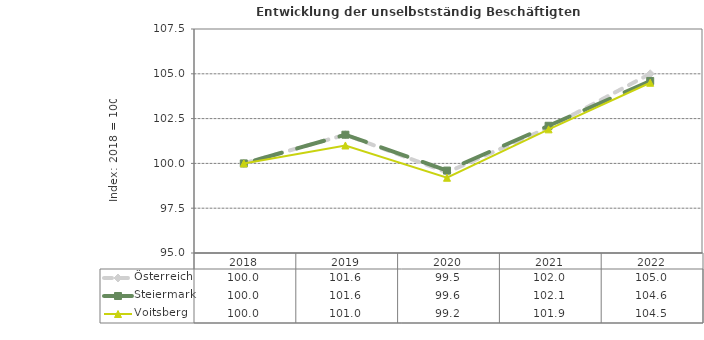
| Category | Österreich | Steiermark | Voitsberg |
|---|---|---|---|
| 2022.0 | 105 | 104.6 | 104.5 |
| 2021.0 | 102 | 102.1 | 101.9 |
| 2020.0 | 99.5 | 99.6 | 99.2 |
| 2019.0 | 101.6 | 101.6 | 101 |
| 2018.0 | 100 | 100 | 100 |